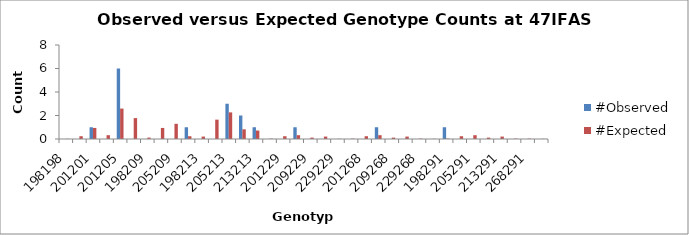
| Category | #Observed | #Expected |
|---|---|---|
| 198198.0 | 0 | 0.015 |
| 198201.0 | 0 | 0.235 |
| 201201.0 | 1 | 0.941 |
| 198205.0 | 0 | 0.324 |
| 201205.0 | 6 | 2.588 |
| 205205.0 | 0 | 1.779 |
| 198209.0 | 0 | 0.118 |
| 201209.0 | 0 | 0.941 |
| 205209.0 | 0 | 1.294 |
| 209209.0 | 1 | 0.235 |
| 198213.0 | 0 | 0.206 |
| 201213.0 | 0 | 1.647 |
| 205213.0 | 3 | 2.265 |
| 209213.0 | 2 | 0.824 |
| 213213.0 | 1 | 0.721 |
| 198229.0 | 0 | 0.029 |
| 201229.0 | 0 | 0.235 |
| 205229.0 | 1 | 0.324 |
| 209229.0 | 0 | 0.118 |
| 213229.0 | 0 | 0.206 |
| 229229.0 | 0 | 0.015 |
| 198268.0 | 0 | 0.029 |
| 201268.0 | 0 | 0.235 |
| 205268.0 | 1 | 0.324 |
| 209268.0 | 0 | 0.118 |
| 213268.0 | 0 | 0.206 |
| 229268.0 | 0 | 0.029 |
| 268268.0 | 0 | 0.015 |
| 198291.0 | 1 | 0.029 |
| 201291.0 | 0 | 0.235 |
| 205291.0 | 0 | 0.324 |
| 209291.0 | 0 | 0.118 |
| 213291.0 | 0 | 0.206 |
| 229291.0 | 0 | 0.029 |
| 268291.0 | 0 | 0.029 |
| 291291.0 | 0 | 0.015 |